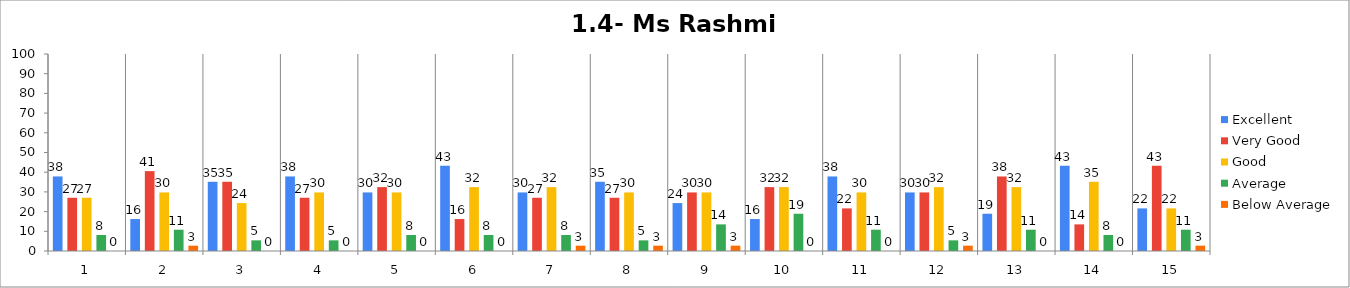
| Category | Excellent | Very Good | Good | Average | Below Average |
|---|---|---|---|---|---|
| 0 | 37.838 | 27.027 | 27.027 | 8.108 | 0 |
| 1 | 16.216 | 40.541 | 29.73 | 10.811 | 2.703 |
| 2 | 35.135 | 35.135 | 24.324 | 5.405 | 0 |
| 3 | 37.838 | 27.027 | 29.73 | 5.405 | 0 |
| 4 | 29.73 | 32.432 | 29.73 | 8.108 | 0 |
| 5 | 43.243 | 16.216 | 32.432 | 8.108 | 0 |
| 6 | 29.73 | 27.027 | 32.432 | 8.108 | 2.703 |
| 7 | 35.135 | 27.027 | 29.73 | 5.405 | 2.703 |
| 8 | 24.324 | 29.73 | 29.73 | 13.514 | 2.703 |
| 9 | 16.216 | 32.432 | 32.432 | 18.919 | 0 |
| 10 | 37.838 | 21.622 | 29.73 | 10.811 | 0 |
| 11 | 29.73 | 29.73 | 32.432 | 5.405 | 2.703 |
| 12 | 18.919 | 37.838 | 32.432 | 10.811 | 0 |
| 13 | 43.243 | 13.514 | 35.135 | 8.108 | 0 |
| 14 | 21.622 | 43.243 | 21.622 | 10.811 | 2.703 |